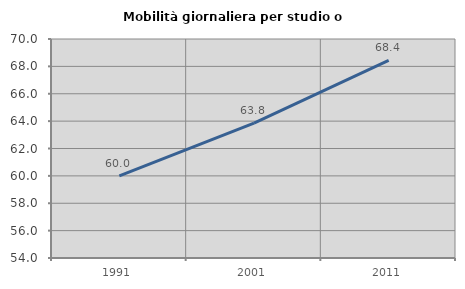
| Category | Mobilità giornaliera per studio o lavoro |
|---|---|
| 1991.0 | 59.994 |
| 2001.0 | 63.847 |
| 2011.0 | 68.441 |